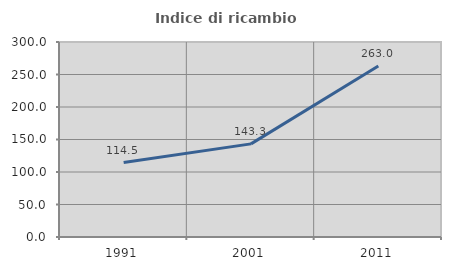
| Category | Indice di ricambio occupazionale  |
|---|---|
| 1991.0 | 114.526 |
| 2001.0 | 143.263 |
| 2011.0 | 262.951 |